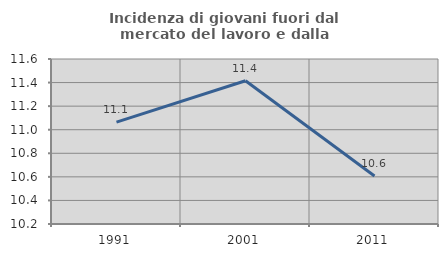
| Category | Incidenza di giovani fuori dal mercato del lavoro e dalla formazione  |
|---|---|
| 1991.0 | 11.065 |
| 2001.0 | 11.416 |
| 2011.0 | 10.607 |